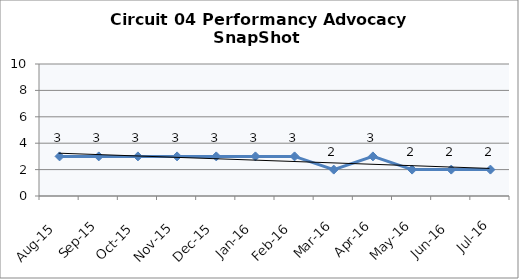
| Category | Circuit 04 |
|---|---|
| Aug-15 | 3 |
| Sep-15 | 3 |
| Oct-15 | 3 |
| Nov-15 | 3 |
| Dec-15 | 3 |
| Jan-16 | 3 |
| Feb-16 | 3 |
| Mar-16 | 2 |
| Apr-16 | 3 |
| May-16 | 2 |
| Jun-16 | 2 |
| Jul-16 | 2 |